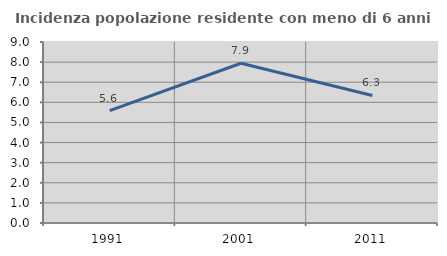
| Category | Incidenza popolazione residente con meno di 6 anni |
|---|---|
| 1991.0 | 5.586 |
| 2001.0 | 7.945 |
| 2011.0 | 6.341 |